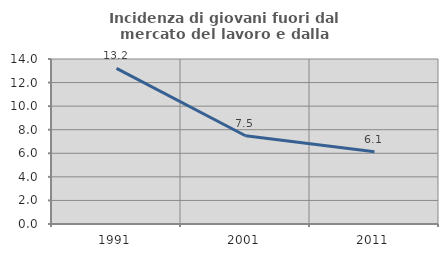
| Category | Incidenza di giovani fuori dal mercato del lavoro e dalla formazione  |
|---|---|
| 1991.0 | 13.2 |
| 2001.0 | 7.487 |
| 2011.0 | 6.122 |